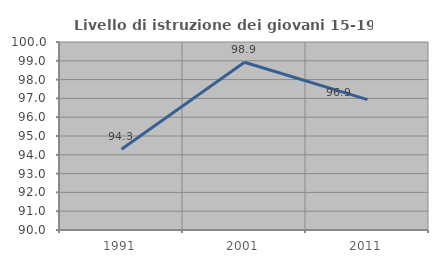
| Category | Livello di istruzione dei giovani 15-19 anni |
|---|---|
| 1991.0 | 94.297 |
| 2001.0 | 98.925 |
| 2011.0 | 96.933 |